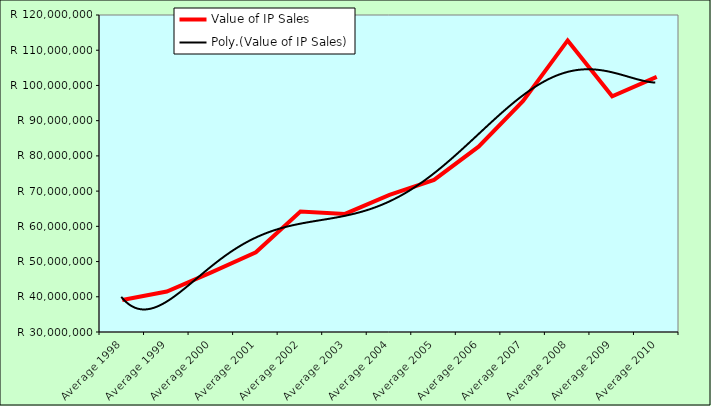
| Category | Value of IP Sales |
|---|---|
| Average 1998 | 39064997.167 |
| Average 1999 | 41498816.583 |
| Average 2000 | 46906615.833 |
| Average 2001 | 52614116.083 |
| Average 2002 | 64216592.5 |
| Average 2003 | 63518696.833 |
| Average 2004 | 68920125.583 |
| Average 2005 | 73199986.5 |
| Average 2006 | 82623586.75 |
| Average 2007 | 95629656.182 |
| Average 2008 | 112782411.583 |
| Average 2009 | 96917016.333 |
| Average 2010 | 102427711.833 |